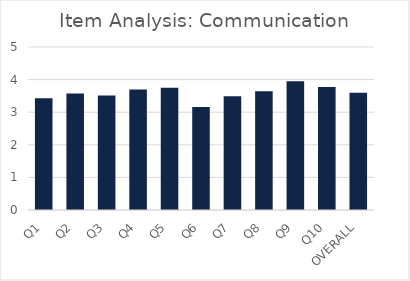
| Category | Series 0 |
|---|---|
| Q1 | 3.43 |
| Q2 | 3.57 |
| Q3 | 3.51 |
| Q4 | 3.7 |
| Q5 | 3.75 |
| Q6 | 3.16 |
| Q7 | 3.49 |
| Q8 | 3.64 |
| Q9 | 3.95 |
| Q10 | 3.77 |
| OVERALL | 3.6 |